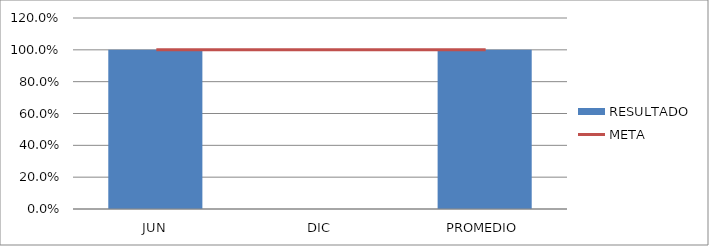
| Category | RESULTADO |
|---|---|
| JUN | 1 |
| DIC | 0 |
| PROMEDIO | 1 |